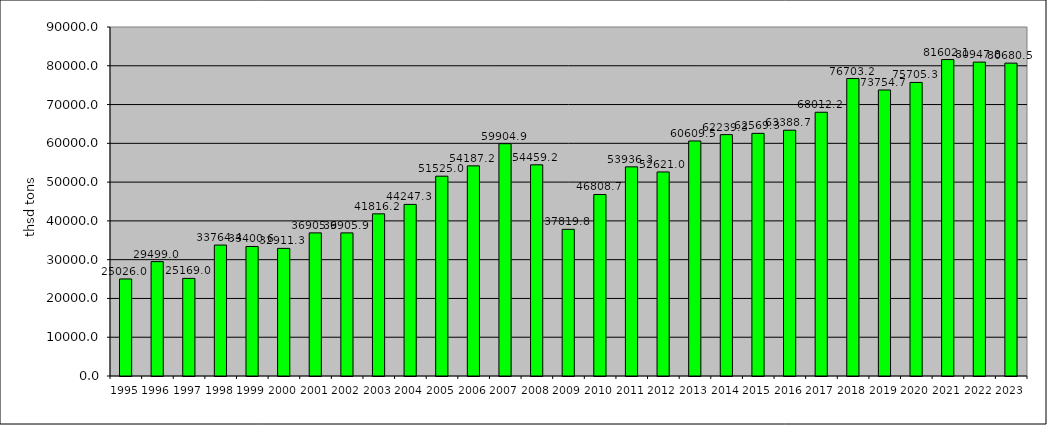
| Category | freigt transported (thou tons) |
|---|---|
| 1995.0 | 25026 |
| 1996.0 | 29499 |
| 1997.0 | 25169 |
| 1998.0 | 33764.4 |
| 1999.0 | 33400.6 |
| 2000.0 | 32911.3 |
| 2001.0 | 36905.9 |
| 2002.0 | 36905.9 |
| 2003.0 | 41816.2 |
| 2004.0 | 44247.3 |
| 2005.0 | 51525 |
| 2006.0 | 54187.2 |
| 2007.0 | 59904.9 |
| 2008.0 | 54459.2 |
| 2009.0 | 37819.8 |
| 2010.0 | 46808.7 |
| 2011.0 | 53936.3 |
| 2012.0 | 52621 |
| 2013.0 | 60609.5 |
| 2014.0 | 62239.3 |
| 2015.0 | 62569.3 |
| 2016.0 | 63388.7 |
| 2017.0 | 68012.2 |
| 2018.0 | 76703.2 |
| 2019.0 | 73754.7 |
| 2020.0 | 75705.3 |
| 2021.0 | 81602.1 |
| 2022.0 | 80947.8 |
| 2023.0 | 80680.5 |